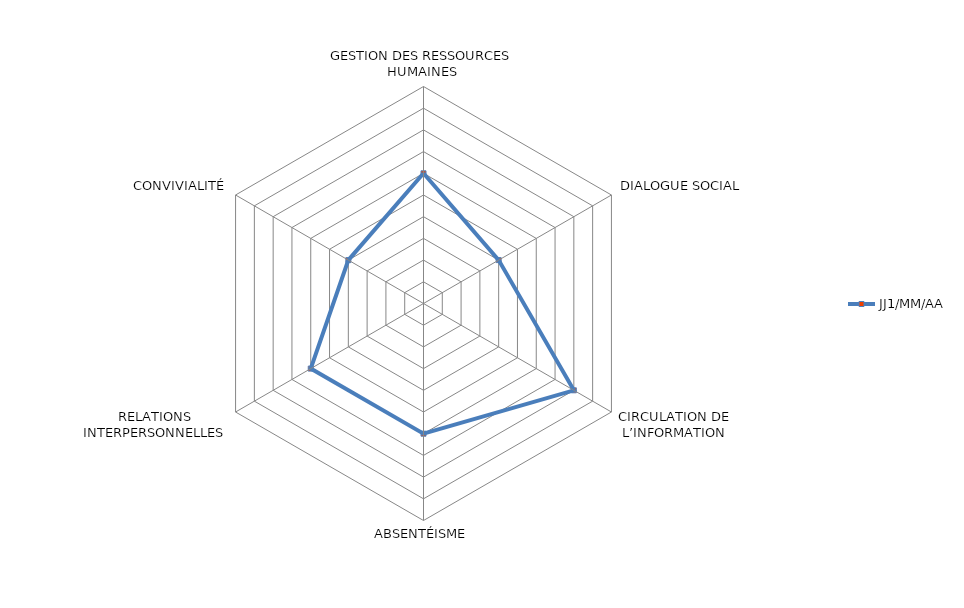
| Category | JJ1/MM/AA |
|---|---|
| GESTION DES RESSOURCES HUMAINES | 6 |
|  DIALOGUE SOCIAL | 4 |
| CIRCULATION DE L’INFORMATION | 8 |
| ABSENTÉISME | 6 |
| RELATIONS INTERPERSONNELLES | 6 |
| CONVIVIALITÉ | 4 |